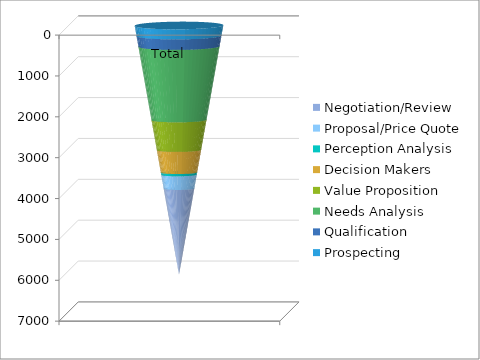
| Category | Prospecting | Qualification | Needs Analysis | Value Proposition | Decision Makers | Perception Analysis | Proposal/Price Quote | Negotiation/Review |
|---|---|---|---|---|---|---|---|---|
| Total | 250 | 261 | 1800 | 735 | 550 | 56 | 340 | 2100 |